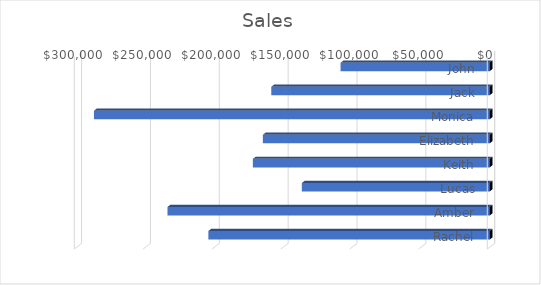
| Category | Sales |
|---|---|
| John | 108225 |
| Jack | 158548 |
| Monica | 287312 |
| Elizabeth | 164669 |
| Keith | 171920 |
| Lucas | 136362 |
| Amber | 233911 |
| Rachel | 204216 |